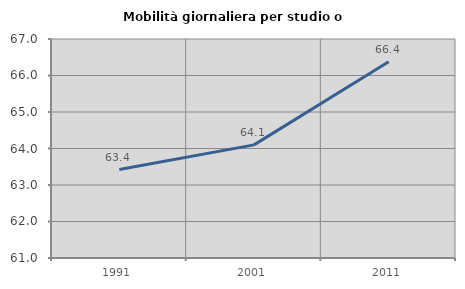
| Category | Mobilità giornaliera per studio o lavoro |
|---|---|
| 1991.0 | 63.423 |
| 2001.0 | 64.1 |
| 2011.0 | 66.377 |